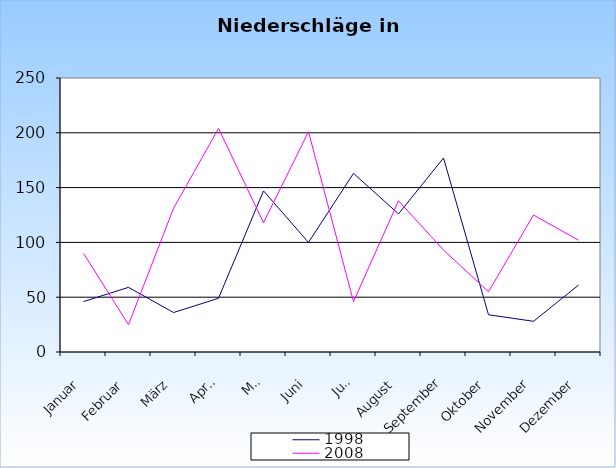
| Category | 1998 | 2008 |
|---|---|---|
| Januar | 46 | 90 |
| Februar | 59 | 25 |
| März | 36 | 131 |
| April | 49 | 204 |
| Mai | 147 | 118 |
| Juni | 100 | 201 |
| Juli | 163 | 46 |
| August | 126 | 138 |
| September | 177 | 93 |
| Oktober | 34 | 55 |
| November | 28 | 125 |
| Dezember | 61 | 102 |